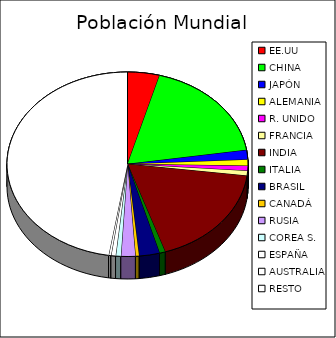
| Category | Pobla-ción |
|---|---|
| EE.UU | 328 |
| CHINA | 1392 |
| JAPÓN | 126.75 |
| ALEMANIA | 82.8 |
| R. UNIDO | 65.648 |
| FRANCIA | 64.942 |
| INDIA | 1365 |
| ITALIA | 60 |
| BRASIL | 210 |
| CANADÁ | 36.591 |
| RUSIA | 146.544 |
| COREA S. | 53 |
| ESPAÑA | 47 |
| AUSTRALIA | 24.576 |
| RESTO | 3619.149 |